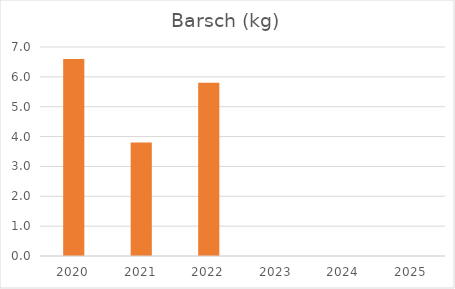
| Category | Barsch (kg) |
|---|---|
| 2020.0 | 6.6 |
| 2021.0 | 3.8 |
| 2022.0 | 5.8 |
| 2023.0 | 0 |
| 2024.0 | 0 |
| 2025.0 | 0 |